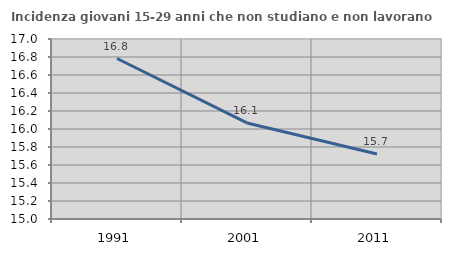
| Category | Incidenza giovani 15-29 anni che non studiano e non lavorano  |
|---|---|
| 1991.0 | 16.783 |
| 2001.0 | 16.067 |
| 2011.0 | 15.722 |